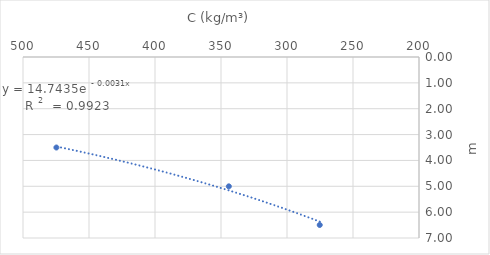
| Category | Series 0 |
|---|---|
| 474.7 | 3.5 |
| 344.0652173913044 | 5.002 |
| 275.2126126126126 | 6.496 |